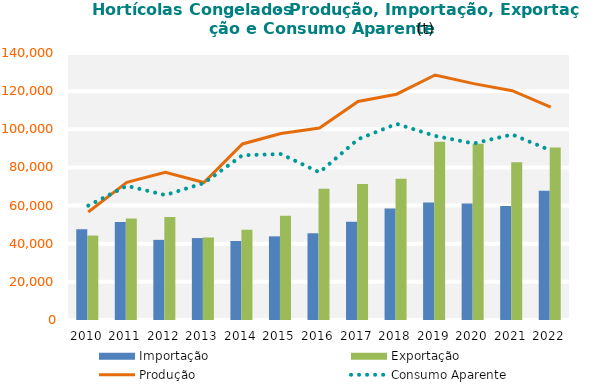
| Category | Importação | Exportação |
|---|---|---|
| 2010.0 | 47624.985 | 44290.166 |
| 2011.0 | 51394.09 | 53202.763 |
| 2012.0 | 42020.511 | 54012.506 |
| 2013.0 | 42957.931 | 43273.026 |
| 2014.0 | 41435.44 | 47379.795 |
| 2015.0 | 43858.485 | 54676.336 |
| 2016.0 | 45505.414 | 68775.595 |
| 2017.0 | 51475.673 | 71256.325 |
| 2018.0 | 58529.662 | 74104.764 |
| 2019.0 | 61558.317 | 93510.613 |
| 2020.0 | 61077.23 | 92458.692 |
| 2021.0 | 59755.39 | 82718.056 |
| 2022.0 | 67718.798 | 90486.974 |